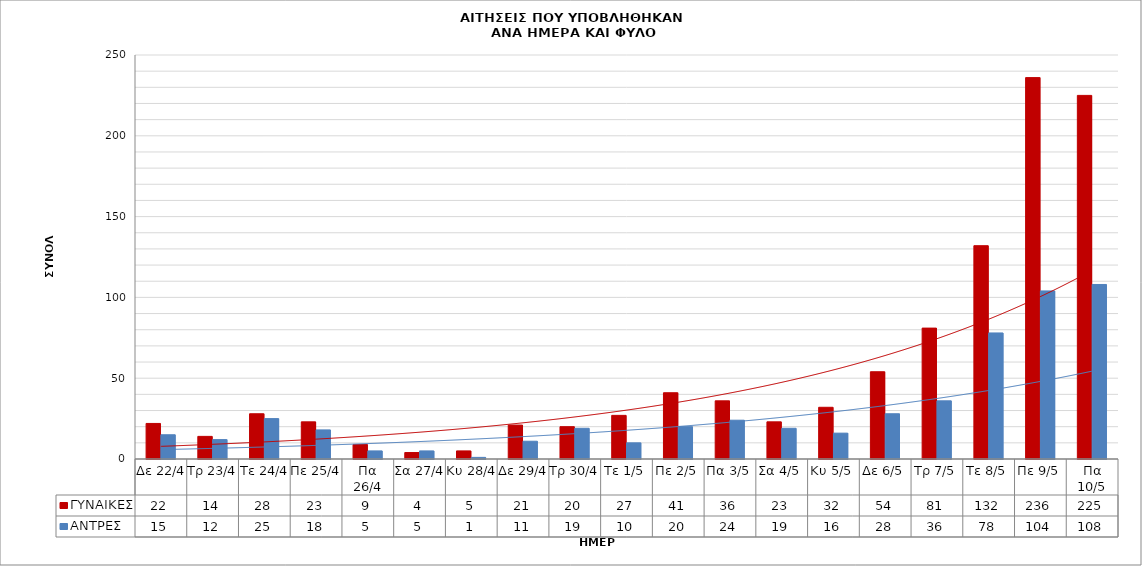
| Category | ΓΥΝΑΙΚΕΣ | ΑΝΤΡΕΣ |
|---|---|---|
| Δε 22/4 | 22 | 15 |
| Τρ 23/4 | 14 | 12 |
| Τε 24/4 | 28 | 25 |
| Πε 25/4 | 23 | 18 |
| Πα 26/4 | 9 | 5 |
| Σα 27/4 | 4 | 5 |
| Κυ 28/4 | 5 | 1 |
| Δε 29/4 | 21 | 11 |
| Τρ 30/4 | 20 | 19 |
| Τε 1/5 | 27 | 10 |
| Πε 2/5 | 41 | 20 |
| Πα 3/5 | 36 | 24 |
| Σα 4/5 | 23 | 19 |
| Κυ 5/5 | 32 | 16 |
| Δε 6/5 | 54 | 28 |
| Τρ 7/5 | 81 | 36 |
| Τε 8/5 | 132 | 78 |
| Πε 9/5 | 236 | 104 |
| Πα 10/5 | 225 | 108 |